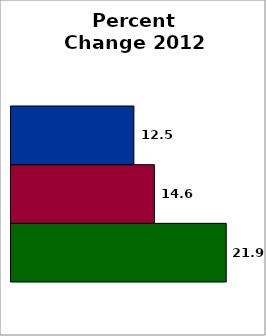
| Category | School | SREB states (average) | 50 states and D.C. (average) |
|---|---|---|---|
| 0 | 21.873 | 14.571 | 12.488 |